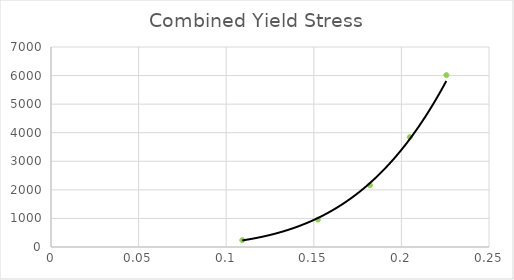
| Category | Combined Yield Stress |
|---|---|
| 0.10917548711199065 | 239.533 |
| 0.1523309221395778 | 960.489 |
| 0.1820403233257018 | 2163.341 |
| 0.20482507074100806 | 3848.247 |
| 0.22566769212354404 | 6015.507 |